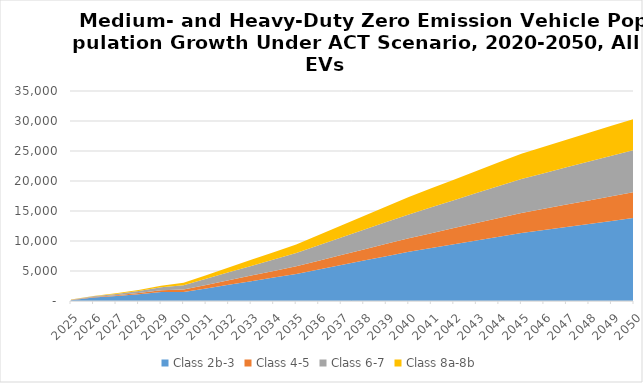
| Category | Class 2b-3 | Class 4-5 | Class 6-7 | Class 8a-8b |
|---|---|---|---|---|
| 2025.0 | 133.498 | 38.379 | 55.94 | 34.23 |
| 2026.0 | 566.538 | 82.036 | 123.577 | 73.025 |
| 2027.0 | 824.767 | 134.216 | 208.779 | 118.944 |
| 2028.0 | 1133.164 | 204.366 | 328.023 | 176.295 |
| 2029.0 | 1500.49 | 296.406 | 490.549 | 248.272 |
| 2030.0 | 1493.01 | 420.344 | 716.801 | 398.699 |
| 2031.0 | 2096.909 | 589.956 | 1014.541 | 605.497 |
| 2032.0 | 2700.807 | 759.568 | 1312.282 | 812.294 |
| 2033.0 | 3304.706 | 929.18 | 1610.022 | 1019.092 |
| 2034.0 | 3908.604 | 1098.792 | 1907.762 | 1225.889 |
| 2035.0 | 4512.503 | 1268.404 | 2205.503 | 1432.687 |
| 2036.0 | 5253.095 | 1464.05 | 2559.363 | 1724.602 |
| 2037.0 | 5993.687 | 1659.696 | 2913.223 | 2016.517 |
| 2038.0 | 6734.279 | 1855.342 | 3267.083 | 2308.432 |
| 2039.0 | 7474.871 | 2050.988 | 3620.942 | 2600.347 |
| 2040.0 | 8215.463 | 2246.634 | 3974.802 | 2892.262 |
| 2041.0 | 8836.369 | 2468.687 | 4313.232 | 3155.002 |
| 2042.0 | 9457.275 | 2690.74 | 4651.662 | 3417.741 |
| 2043.0 | 10078.181 | 2912.793 | 4990.092 | 3680.481 |
| 2044.0 | 10699.087 | 3134.846 | 5328.522 | 3943.221 |
| 2045.0 | 11319.993 | 3356.899 | 5666.952 | 4205.96 |
| 2046.0 | 11824.011 | 3549.429 | 5937.095 | 4399.208 |
| 2047.0 | 12328.03 | 3741.958 | 6207.239 | 4592.455 |
| 2048.0 | 12832.048 | 3934.487 | 6477.382 | 4785.702 |
| 2049.0 | 13336.066 | 4127.016 | 6747.525 | 4978.949 |
| 2050.0 | 13840.085 | 4319.545 | 7017.668 | 5172.196 |